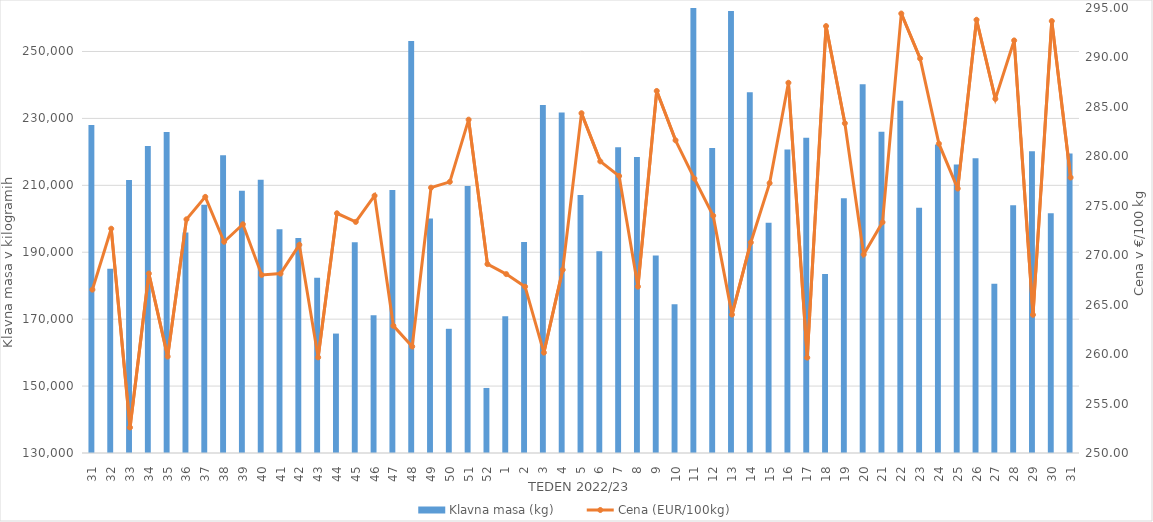
| Category | Klavna masa (kg) |
|---|---|
| 31.0 | 228023 |
| 32.0 | 185079 |
| 33.0 | 211612 |
| 34.0 | 221748 |
| 35.0 | 225927 |
| 36.0 | 195924 |
| 37.0 | 204224 |
| 38.0 | 218966 |
| 39.0 | 208403 |
| 40.0 | 211635 |
| 41.0 | 196841 |
| 42.0 | 194271 |
| 43.0 | 182399 |
| 44.0 | 165696 |
| 45.0 | 193022 |
| 46.0 | 171172 |
| 47.0 | 208597 |
| 48.0 | 253151 |
| 49.0 | 200117 |
| 50.0 | 167119 |
| 51.0 | 209797 |
| 52.0 | 149439 |
| 1.0 | 170843 |
| 2.0 | 193093 |
| 3.0 | 234042 |
| 4.0 | 231737 |
| 5.0 | 207136 |
| 6.0 | 190311 |
| 7.0 | 221366 |
| 8.0 | 218470 |
| 9.0 | 189006 |
| 10.0 | 174425 |
| 11.0 | 265476 |
| 12.0 | 221171 |
| 13.0 | 262102 |
| 14.0 | 237813 |
| 15.0 | 198828 |
| 16.0 | 220686 |
| 17.0 | 224192 |
| 18.0 | 183508 |
| 19.0 | 206133 |
| 20.0 | 240223 |
| 21.0 | 226050 |
| 22.0 | 235273 |
| 23.0 | 203306 |
| 24.0 | 222178 |
| 25.0 | 216259 |
| 26.0 | 218064 |
| 27.0 | 180556 |
| 28.0 | 204078 |
| 29.0 | 220162 |
| 30.0 | 201649 |
| 31.0 | 219538 |